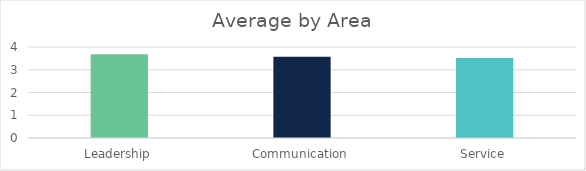
| Category | Series 0 |
|---|---|
| Leadership | 3.68 |
| Communication | 3.57 |
| Service | 3.52 |